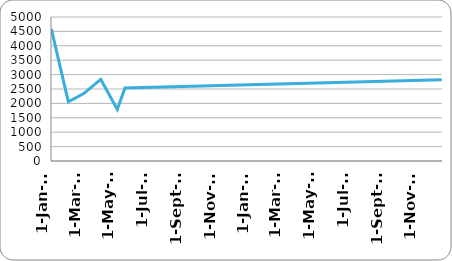
| Category | شاشة عرض |
|---|---|
| 2012-01-01 | 4585 |
| 2012-02-01 | 2059 |
| 2012-02-29 | 2342 |
| 2012-03-31 | 2833 |
| 2012-04-30 | 1792 |
| 2012-05-14 | 2539 |
| 2013-12-11 | 2818 |